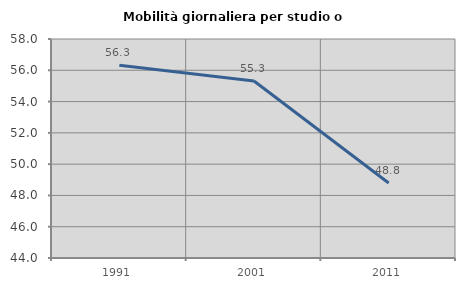
| Category | Mobilità giornaliera per studio o lavoro |
|---|---|
| 1991.0 | 56.328 |
| 2001.0 | 55.319 |
| 2011.0 | 48.793 |